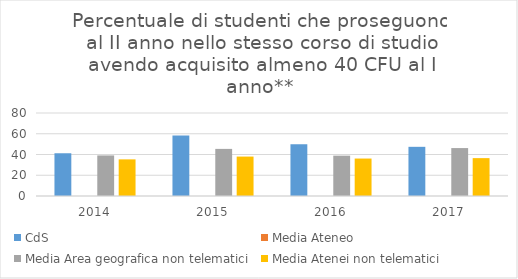
| Category | CdS | Media Ateneo | Media Area geografica non telematici | Media Atenei non telematici |
|---|---|---|---|---|
| 2014.0 | 41.2 |  | 39.1 | 35.3 |
| 2015.0 | 58.3 |  | 45.4 | 38 |
| 2016.0 | 50 |  | 38.9 | 36.1 |
| 2017.0 | 47.4 |  | 46.2 | 36.5 |